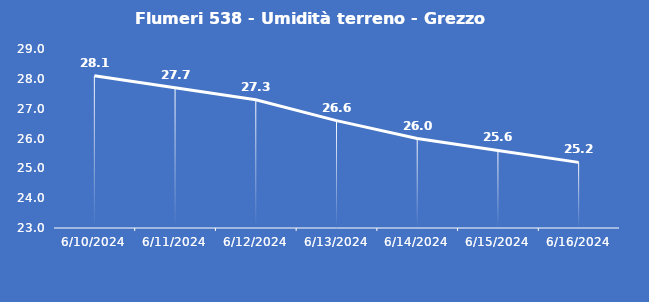
| Category | Flumeri 538 - Umidità terreno - Grezzo (%VWC) |
|---|---|
| 6/10/24 | 28.1 |
| 6/11/24 | 27.7 |
| 6/12/24 | 27.3 |
| 6/13/24 | 26.6 |
| 6/14/24 | 26 |
| 6/15/24 | 25.6 |
| 6/16/24 | 25.2 |